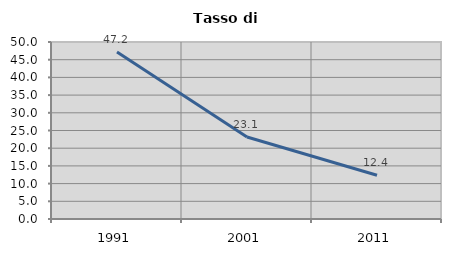
| Category | Tasso di disoccupazione   |
|---|---|
| 1991.0 | 47.17 |
| 2001.0 | 23.148 |
| 2011.0 | 12.364 |